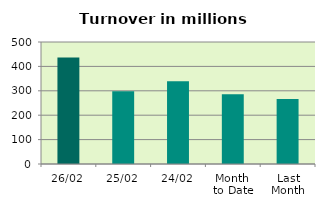
| Category | Series 0 |
|---|---|
| 26/02 | 435.995 |
| 25/02 | 297.69 |
| 24/02 | 339.617 |
| Month 
to Date | 285.972 |
| Last
Month | 265.89 |